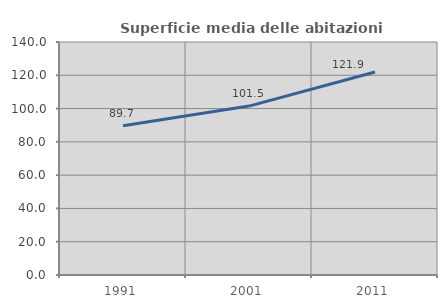
| Category | Superficie media delle abitazioni occupate |
|---|---|
| 1991.0 | 89.739 |
| 2001.0 | 101.489 |
| 2011.0 | 121.943 |